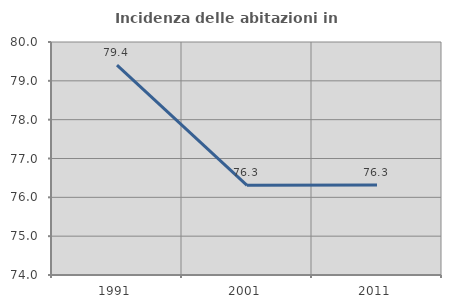
| Category | Incidenza delle abitazioni in proprietà  |
|---|---|
| 1991.0 | 79.405 |
| 2001.0 | 76.31 |
| 2011.0 | 76.316 |